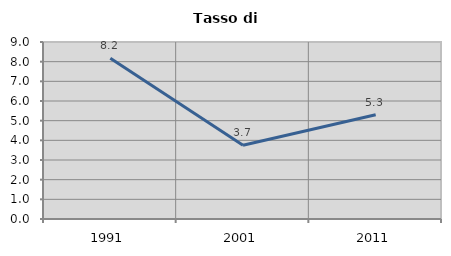
| Category | Tasso di disoccupazione   |
|---|---|
| 1991.0 | 8.171 |
| 2001.0 | 3.748 |
| 2011.0 | 5.304 |